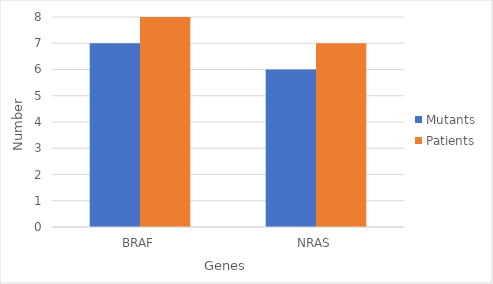
| Category | Mutants | Patients |
|---|---|---|
| BRAF | 7 | 8 |
| NRAS | 6 | 7 |